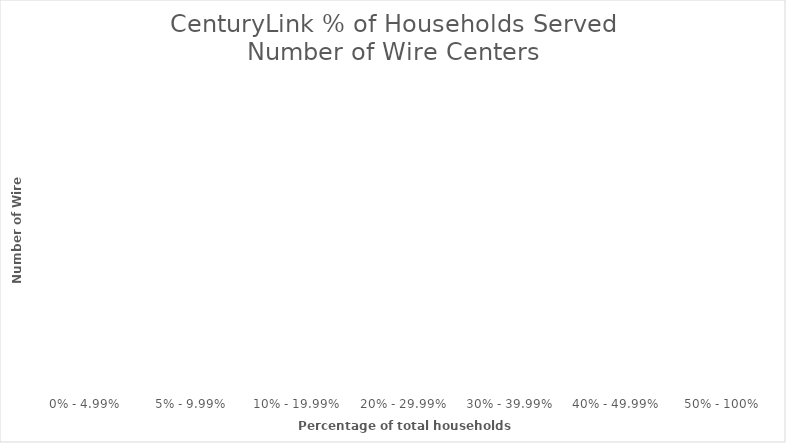
| Category | Series 0 |
|---|---|
| 0% - 4.99% | 0 |
| 5% - 9.99% | 0 |
| 10% - 19.99% | 0 |
| 20% - 29.99% | 0 |
| 30% - 39.99% | 0 |
| 40% - 49.99% | 0 |
| 50% - 100% | 0 |